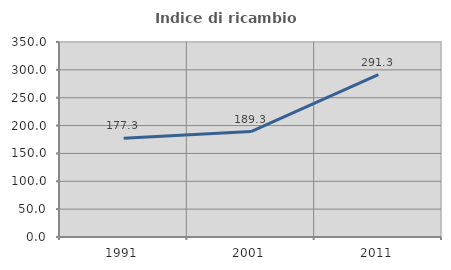
| Category | Indice di ricambio occupazionale  |
|---|---|
| 1991.0 | 177.273 |
| 2001.0 | 189.286 |
| 2011.0 | 291.304 |